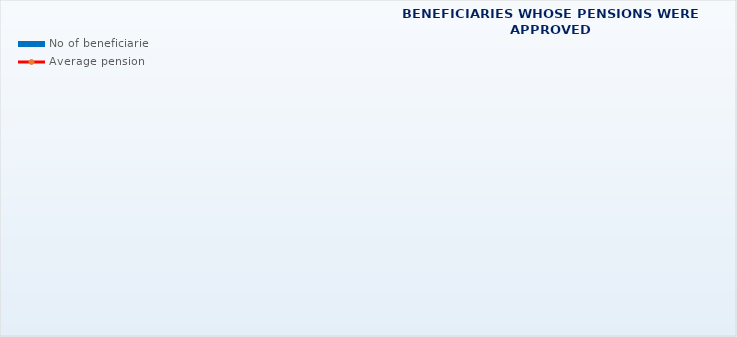
| Category | No of beneficiaries |
|---|---|
| Authorised officials in internal affairs, judicial officers and workers engaged in demining work: | 17264 |
| Pension beneficiaries entitled under the Fire Services Act (Official Gazette 125/19) | 304 |
| Active military personnel - DVO  | 16104 |
| Croatian Homeland Army veterans mobilised from 1941 to 1945 | 2258 |
| Former political prisoners | 2224 |
| Croatian Veterans from the Homeland War - ZOHBDR (Act on Croatian Homeland War Veterans and Their Family Members) | 71222 |
| Pensions approved under general regulations and determined according to the Act on the Rights of Croatian Homeland War Veterans and their Family Members (ZOHBDR), in 2017 (Art. 27, 35, 48 and 49, paragraph 2)    | 55405 |
| Former Yugoslav People's Army members - JNA   | 4014 |
| Former Yugoslav People's Army members - JNA - Art. 185 of Pension Insurance Act (ZOMO)  | 160 |
| National Liberation War veterans - NOR | 5712 |
| Members of the Croatian Parliament, members of the Government, judges of the Constitutional Court and the Auditor General | 685 |
| Members of the Parliamentary Executive Council and administratively retired federal civil servants  (relates to the former SFRY) | 69 |
| Former officials of federal bodies o the former SFRJ -  Article 38 of the Pension Insurance Act (ZOMO) | 21 |
| Full members of the Croatian Academy of Sciences and Arts - HAZU | 129 |
| Miners from the Istrian coal mines "Tupljak" d.d. Labin  | 248 |
| Workers professionally exposed to asbestos | 835 |
| Insurees - crew members on a ship in international and national navigation  - Article  129, paragraph 2 of the Maritime Code | 205 |
| Members of the Croatian Defence Council - HVO  | 6764 |